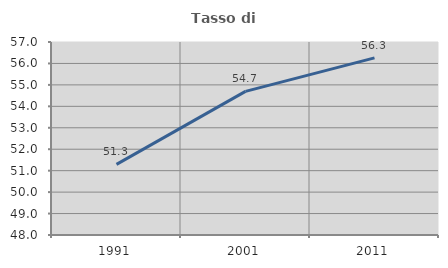
| Category | Tasso di occupazione   |
|---|---|
| 1991.0 | 51.295 |
| 2001.0 | 54.697 |
| 2011.0 | 56.259 |